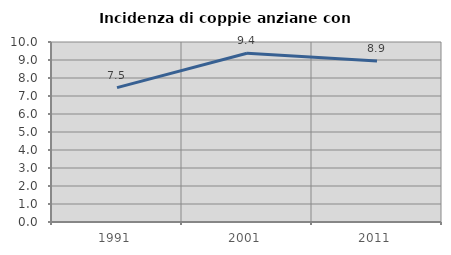
| Category | Incidenza di coppie anziane con figli |
|---|---|
| 1991.0 | 7.468 |
| 2001.0 | 9.375 |
| 2011.0 | 8.943 |